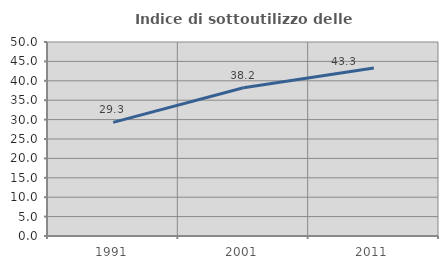
| Category | Indice di sottoutilizzo delle abitazioni  |
|---|---|
| 1991.0 | 29.286 |
| 2001.0 | 38.222 |
| 2011.0 | 43.277 |